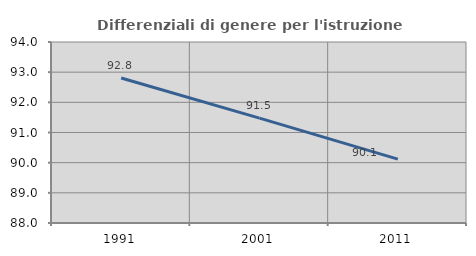
| Category | Differenziali di genere per l'istruzione superiore |
|---|---|
| 1991.0 | 92.807 |
| 2001.0 | 91.475 |
| 2011.0 | 90.116 |